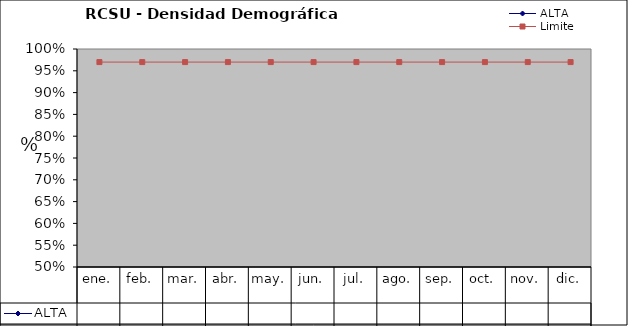
| Category | ALTA | Limite |
|---|---|---|
| ene. |  | 0.97 |
| feb. |  | 0.97 |
| mar. |  | 0.97 |
| abr. |  | 0.97 |
| may. |  | 0.97 |
| jun. |  | 0.97 |
| jul. |  | 0.97 |
| ago. |  | 0.97 |
| sep. |  | 0.97 |
| oct. |  | 0.97 |
| nov. |  | 0.97 |
| dic. |  | 0.97 |